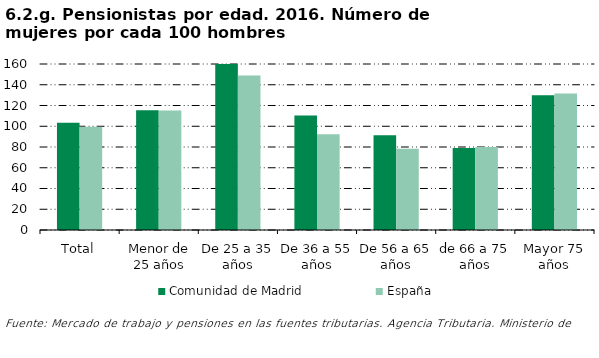
| Category | Comunidad de Madrid | España |
|---|---|---|
| Total | 103.378 | 99.483 |
| Menor de 25 años | 115.399 | 115.117 |
| De 25 a 35 años | 175.134 | 148.948 |
| De 36 a 55 años | 110.257 | 92.248 |
| De 56 a 65 años | 91.32 | 78.278 |
| de 66 a 75 años | 79.09 | 79.881 |
| Mayor 75 años | 129.922 | 131.656 |